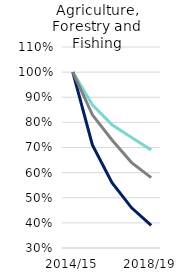
| Category | UK and RoI | EEA | Non-EEA |
|---|---|---|---|
| 2014/15 | 1 | 1 | 1 |
| 2015/16 | 0.87 | 0.71 | 0.83 |
| 2016/16 | 0.79 | 0.56 | 0.73 |
| 2017/18 | 0.74 | 0.46 | 0.64 |
| 2018/19 | 0.69 | 0.39 | 0.58 |